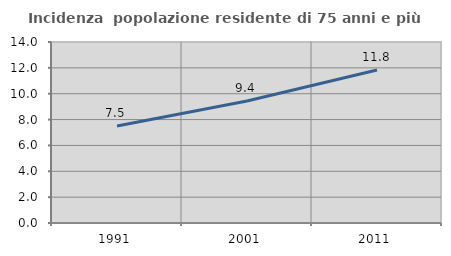
| Category | Incidenza  popolazione residente di 75 anni e più |
|---|---|
| 1991.0 | 7.496 |
| 2001.0 | 9.442 |
| 2011.0 | 11.841 |